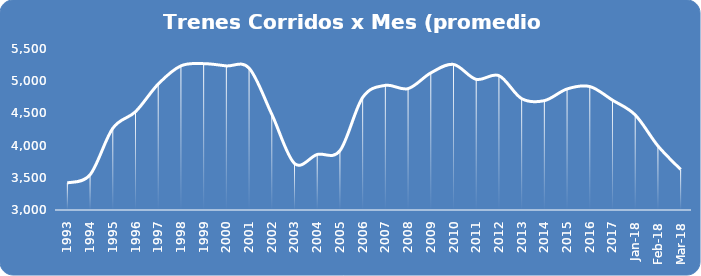
| Category | Series 0 |
|---|---|
| 1993.0 | 3420.25 |
| 1994.0 | 3547.25 |
| 1995.0 | 4268.917 |
| 1996.0 | 4526.417 |
| 1997.0 | 4956.25 |
| 1998.0 | 5238.083 |
| 1999.0 | 5272.75 |
| 2000.0 | 5237.75 |
| 2001.0 | 5203 |
| 2002.0 | 4487 |
| 2003.0 | 3723 |
| 2004.0 | 3862.167 |
| 2005.0 | 3921.083 |
| 2006.0 | 4747.25 |
| 2007.0 | 4935.583 |
| 2008.0 | 4884.5 |
| 2009.0 | 5128.583 |
| 2010.0 | 5260.333 |
| 2011.0 | 5028.417 |
| 2012.0 | 5086.25 |
| 2013.0 | 4729.583 |
| 2014.0 | 4697.917 |
| 2015.0 | 4879.417 |
| 2016.0 | 4916.833 |
| 2017.0 | 4705.583 |
| 43101.0 | 4476 |
| 43132.0 | 3995 |
| 43160.0 | 3629 |